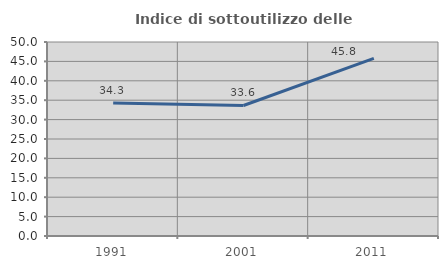
| Category | Indice di sottoutilizzo delle abitazioni  |
|---|---|
| 1991.0 | 34.259 |
| 2001.0 | 33.636 |
| 2011.0 | 45.794 |